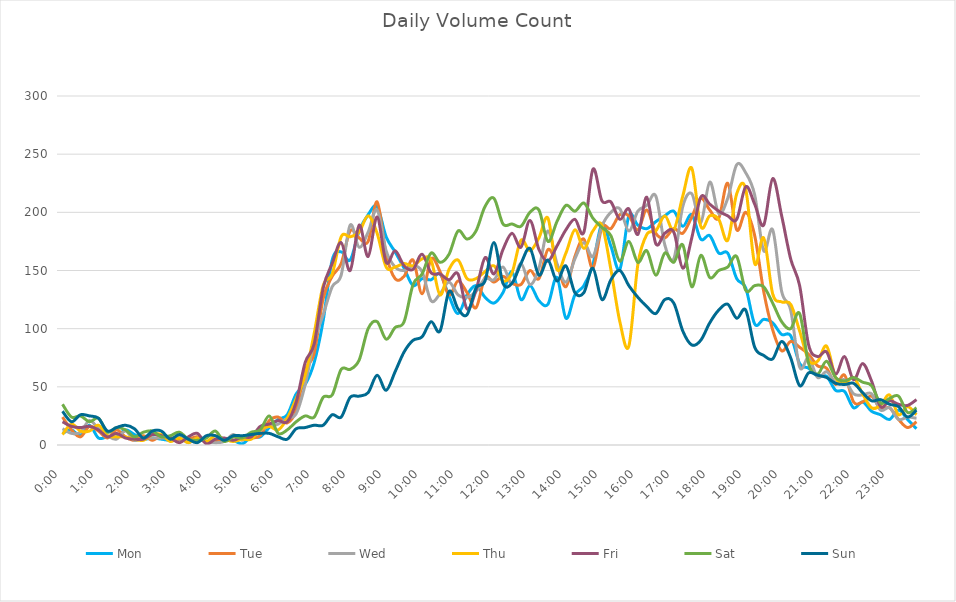
| Category | Mon | Tue | Wed | Thu | Fri | Sat | Sun |
|---|---|---|---|---|---|---|---|
| 0.0 | 10 | 24 | 14 | 9 | 20 | 35 | 29 |
| 0.010416666666666666 | 13 | 13 | 10 | 18 | 16 | 24 | 20 |
| 0.020833333333333332 | 8 | 7 | 11 | 12 | 15 | 25 | 26 |
| 0.03125 | 17 | 16 | 21 | 12 | 16 | 20 | 25 |
| 0.041666666666666664 | 6 | 12 | 14 | 17 | 13 | 23 | 23 |
| 0.05208333333333333 | 7 | 6 | 8 | 8 | 7 | 11 | 12 |
| 0.06249999999999999 | 7 | 13 | 5 | 7 | 10 | 15 | 15 |
| 0.07291666666666666 | 13 | 7 | 12 | 7 | 6 | 13 | 17 |
| 0.08333333333333333 | 9 | 4 | 4 | 5 | 5 | 7 | 14 |
| 0.09375 | 5 | 8 | 6 | 4 | 5 | 11 | 6 |
| 0.10416666666666667 | 6 | 4 | 6 | 9 | 9 | 12 | 12 |
| 0.11458333333333334 | 5 | 8 | 6 | 9 | 8 | 7 | 12 |
| 0.125 | 4 | 4 | 6 | 3 | 6 | 8 | 5 |
| 0.13541666666666666 | 5 | 5 | 7 | 6 | 2 | 11 | 9 |
| 0.14583333333333331 | 4 | 5 | 2 | 2 | 7 | 5 | 5 |
| 0.15624999999999997 | 5 | 7 | 6 | 6 | 10 | 4 | 2 |
| 0.16666666666666663 | 3 | 2 | 3 | 3 | 1 | 6 | 8 |
| 0.1770833333333333 | 3 | 3 | 2 | 8 | 5 | 12 | 8 |
| 0.18749999999999994 | 4 | 4 | 3 | 5 | 6 | 3 | 4 |
| 0.1979166666666666 | 4 | 4 | 9 | 3 | 4 | 7 | 8 |
| 0.20833333333333326 | 1 | 5 | 4 | 5 | 7 | 6 | 8 |
| 0.21874999999999992 | 7 | 6 | 10 | 5 | 7 | 11 | 9 |
| 0.22916666666666657 | 7 | 8 | 13 | 13 | 16 | 13 | 10 |
| 0.23958333333333323 | 15 | 21 | 16 | 16 | 18 | 25 | 10 |
| 0.2499999999999999 | 22 | 24 | 18 | 13 | 21 | 10 | 7 |
| 0.2604166666666666 | 26 | 19 | 23 | 23 | 20 | 13 | 5 |
| 0.27083333333333326 | 44 | 30 | 27 | 40 | 37 | 20 | 14 |
| 0.28124999999999994 | 52 | 64 | 52 | 60 | 71 | 25 | 15 |
| 0.29166666666666663 | 71 | 79 | 89 | 96 | 87 | 24 | 17 |
| 0.3020833333333333 | 107 | 126 | 112 | 137 | 135 | 41 | 17 |
| 0.3125 | 159 | 145 | 136 | 147 | 156 | 43 | 26 |
| 0.3229166666666667 | 166 | 156 | 146 | 179 | 174 | 65 | 24 |
| 0.33333333333333337 | 159 | 184 | 189 | 179 | 150 | 65 | 41 |
| 0.34375000000000006 | 184 | 178 | 170 | 183 | 189 | 73 | 42 |
| 0.35416666666666674 | 198 | 175 | 183 | 197 | 162 | 100 | 45 |
| 0.3645833333333334 | 205 | 209 | 202 | 182 | 196 | 106 | 60 |
| 0.3750000000000001 | 179 | 164 | 167 | 153 | 157 | 91 | 47 |
| 0.3854166666666668 | 166 | 143 | 153 | 153 | 167 | 101 | 63 |
| 0.3958333333333335 | 152 | 145 | 150 | 156 | 154 | 106 | 80 |
| 0.40625000000000017 | 137 | 159 | 154 | 154 | 151 | 138 | 90 |
| 0.41666666666666685 | 143 | 130 | 149 | 160 | 164 | 147 | 93 |
| 0.4270833333333333 | 142 | 160 | 124 | 159 | 148 | 165 | 106 |
| 0.4375000000000002 | 147 | 149 | 130 | 129 | 147 | 157 | 98 |
| 0.4479166666666669 | 128 | 129 | 140 | 151 | 142 | 164 | 132 |
| 0.4583333333333333 | 113 | 141 | 129 | 159 | 147 | 184 | 117 |
| 0.4687500000000003 | 129 | 131 | 127 | 143 | 117 | 177 | 112 |
| 0.47916666666666696 | 137 | 118 | 132 | 143 | 133 | 184 | 135 |
| 0.4895833333333333 | 127 | 144 | 143 | 149 | 161 | 205 | 141 |
| 0.5000000000000003 | 122 | 140 | 142 | 154 | 147 | 212 | 174 |
| 0.510416666666667 | 131 | 145 | 153 | 141 | 168 | 190 | 139 |
| 0.5208333333333334 | 149 | 139 | 139 | 148 | 182 | 190 | 139 |
| 0.5312500000000002 | 125 | 138 | 156 | 176 | 170 | 188 | 156 |
| 0.5416666666666669 | 137 | 150 | 138 | 167 | 193 | 200 | 169 |
| 0.5520833333333335 | 124 | 143 | 152 | 178 | 168 | 202 | 146 |
| 0.5625000000000001 | 121 | 168 | 184 | 195 | 158 | 175 | 159 |
| 0.5729166666666667 | 144 | 155 | 156 | 151 | 171 | 192 | 141 |
| 0.5833333333333334 | 109 | 136 | 140 | 165 | 185 | 206 | 154 |
| 0.59375 | 129 | 162 | 160 | 185 | 194 | 201 | 131 |
| 0.6041666666666666 | 137 | 177 | 174 | 169 | 183 | 208 | 131 |
| 0.6145833333333333 | 155 | 152 | 162 | 184 | 237 | 195 | 152 |
| 0.6249999999999999 | 190 | 187 | 188 | 189 | 210 | 187 | 125 |
| 0.6354166666666665 | 171 | 186 | 200 | 151 | 209 | 180 | 142 |
| 0.6458333333333331 | 151 | 198 | 203 | 106 | 194 | 158 | 150 |
| 0.6562499999999998 | 197 | 197 | 184 | 85 | 203 | 175 | 137 |
| 0.6666666666666666 | 189 | 185 | 201 | 155 | 181 | 157 | 127 |
| 0.677083333333333 | 186 | 202 | 206 | 181 | 213 | 167 | 119 |
| 0.6874999999999997 | 192 | 182 | 214 | 184 | 173 | 146 | 113 |
| 0.6979166666666666 | 197 | 178 | 172 | 197 | 182 | 165 | 125 |
| 0.7083333333333329 | 201 | 186 | 160 | 185 | 183 | 157 | 122 |
| 0.7187499999999996 | 188 | 182 | 205 | 214 | 152 | 172 | 98 |
| 0.7291666666666666 | 198 | 196 | 216 | 238 | 178 | 136 | 86 |
| 0.7395833333333328 | 177 | 212 | 191 | 188 | 213 | 163 | 90 |
| 0.75 | 180 | 202 | 226 | 197 | 207 | 144 | 105 |
| 0.7604166666666666 | 165 | 195 | 199 | 194 | 201 | 150 | 116 |
| 0.7708333333333327 | 165 | 225 | 212 | 176 | 197 | 153 | 121 |
| 0.78125 | 143 | 185 | 241 | 216 | 194 | 162 | 109 |
| 0.7916666666666666 | 135 | 200 | 234 | 220 | 222 | 133 | 116 |
| 0.8020833333333326 | 104 | 180 | 215 | 156 | 207 | 137 | 84 |
| 0.8125 | 108 | 132 | 167 | 178 | 189 | 136 | 77 |
| 0.8229166666666666 | 105 | 99 | 185 | 130 | 229 | 122 | 74 |
| 0.8333333333333334 | 95 | 81 | 132 | 123 | 197 | 106 | 89 |
| 0.84375 | 94 | 89 | 116 | 121 | 160 | 100 | 75 |
| 0.8541666666666666 | 70 | 84 | 67 | 98 | 137 | 113 | 51 |
| 0.8645833333333334 | 66 | 78 | 75 | 73 | 86 | 70 | 62 |
| 0.875 | 59 | 68 | 58 | 72 | 76 | 61 | 60 |
| 0.8854166666666666 | 59 | 66 | 63 | 85 | 80 | 72 | 58 |
| 0.8958333333333334 | 47 | 52 | 54 | 58 | 61 | 58 | 53 |
| 0.90625 | 46 | 60 | 56 | 53 | 76 | 55 | 52 |
| 0.9166666666666666 | 32 | 37 | 44 | 58 | 56 | 58 | 53 |
| 0.9270833333333334 | 37 | 37 | 43 | 44 | 70 | 54 | 45 |
| 0.9375 | 29 | 42 | 44 | 32 | 55 | 51 | 38 |
| 0.9479166666666666 | 26 | 31 | 30 | 34 | 33 | 36 | 39 |
| 0.9583333333333334 | 22 | 32 | 32 | 43 | 38 | 40 | 35 |
| 0.96875 | 30 | 22 | 22 | 26 | 35 | 42 | 33 |
| 0.9791666666666666 | 22 | 15 | 24 | 33 | 34 | 28 | 24 |
| 0.9895833333333334 | 14 | 20 | 23 | 26 | 39 | 32 | 30 |